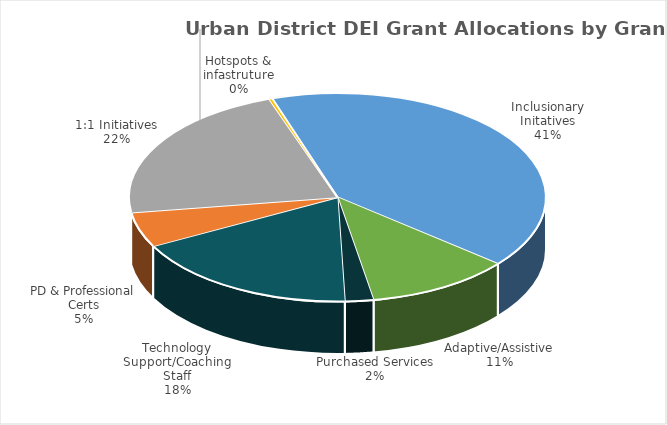
| Category | $1,354,626 |
|---|---|
| Technology Support/Coaching Staff | 1354626 |
| PD & Professional Certs | 414240 |
| 1:1 Initiatives | 1672536 |
| Hotspots & infastruture | 19750 |
| Inclusionary Initatives | 3128501 |
| Adaptive/Assistive | 852136 |
| Purchased Services | 167674 |